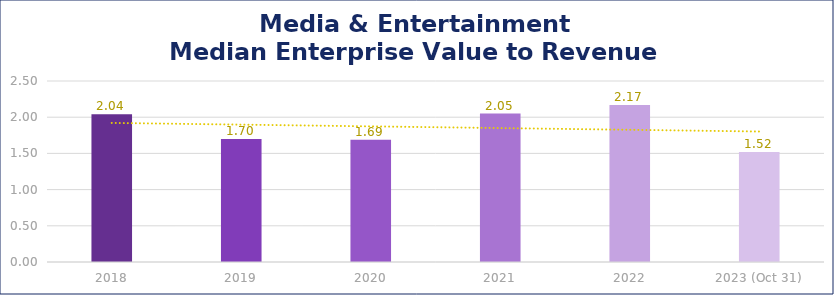
| Category | Media & Entertainment |
|---|---|
| 2018 | 2.04 |
| 2019 | 1.7 |
| 2020 | 1.69 |
| 2021 | 2.05 |
| 2022 | 2.17 |
| 2023 (Oct 31) | 1.52 |